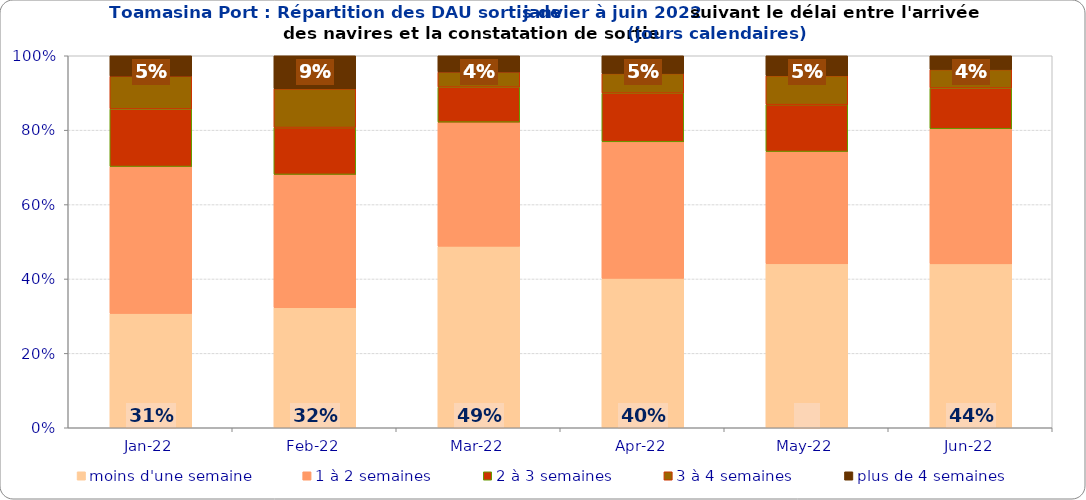
| Category | moins d'une semaine | 1 à 2 semaines | 2 à 3 semaines | 3 à 4 semaines | plus de 4 semaines |
|---|---|---|---|---|---|
| 2022-01-01 | 0.307 | 0.395 | 0.155 | 0.088 | 0.055 |
| 2022-02-01 | 0.323 | 0.358 | 0.126 | 0.104 | 0.089 |
| 2022-03-01 | 0.488 | 0.334 | 0.094 | 0.041 | 0.044 |
| 2022-04-01 | 0.402 | 0.367 | 0.131 | 0.053 | 0.048 |
| 2022-05-01 | 0.441 | 0.302 | 0.126 | 0.078 | 0.054 |
| 2022-06-01 | 0.441 | 0.363 | 0.109 | 0.05 | 0.037 |